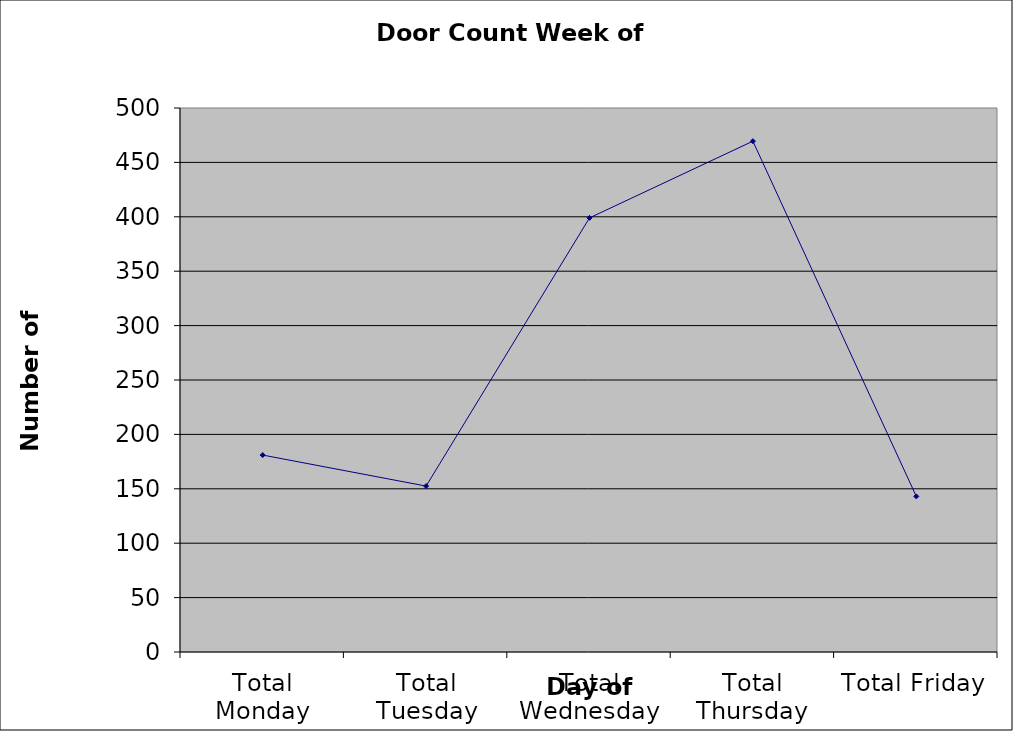
| Category | Series 0 |
|---|---|
| Total Monday | 181 |
| Total Tuesday | 152.5 |
| Total Wednesday | 399 |
| Total Thursday | 469.5 |
| Total Friday | 143 |